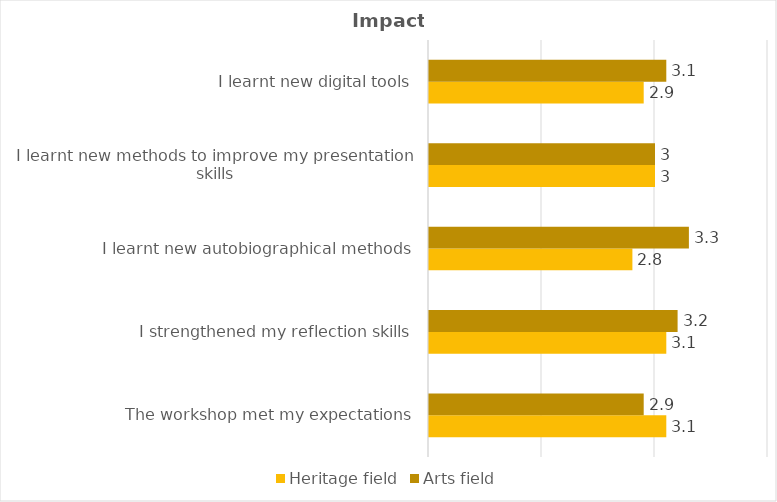
| Category | Heritage field | Arts field |
|---|---|---|
| The workshop met my expectations | 3.1 | 2.9 |
| I strengthened my reflection skills | 3.1 | 3.2 |
| I learnt new autobiographical methods | 2.8 | 3.3 |
| I learnt new methods to improve my presentation skills | 3 | 3 |
| I learnt new digital tools | 2.9 | 3.1 |